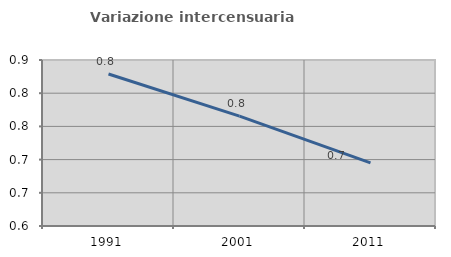
| Category | Variazione intercensuaria annua |
|---|---|
| 1991.0 | 0.829 |
| 2001.0 | 0.765 |
| 2011.0 | 0.695 |